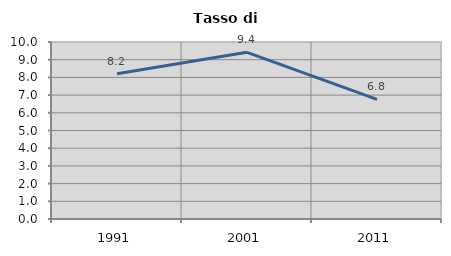
| Category | Tasso di disoccupazione   |
|---|---|
| 1991.0 | 8.211 |
| 2001.0 | 9.417 |
| 2011.0 | 6.762 |